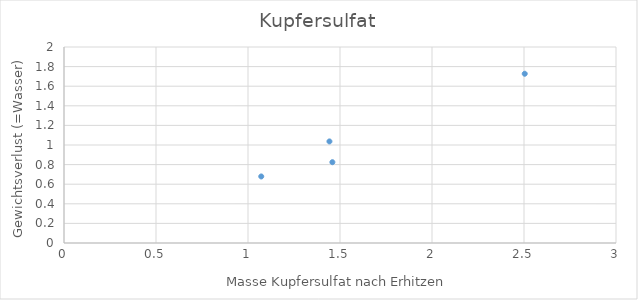
| Category | Series 0 |
|---|---|
| 1.4426 | 1.036 |
| 1.4586 | 0.825 |
| 1.072 | 0.679 |
| 2.504 | 1.727 |